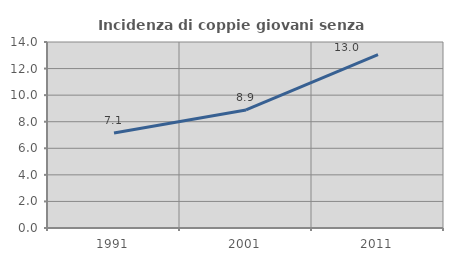
| Category | Incidenza di coppie giovani senza figli |
|---|---|
| 1991.0 | 7.143 |
| 2001.0 | 8.889 |
| 2011.0 | 13.043 |